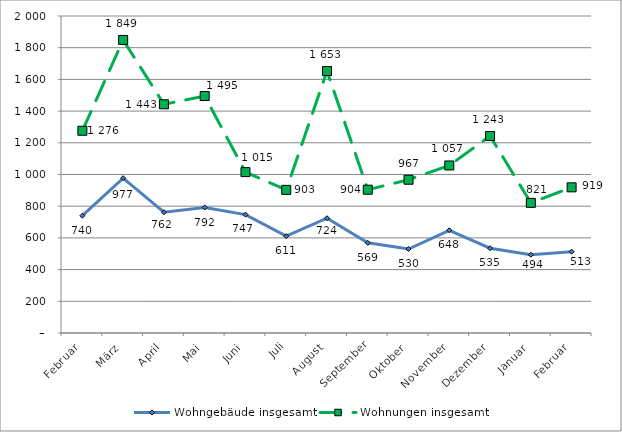
| Category | Wohngebäude insgesamt | Wohnungen insgesamt |
|---|---|---|
| Februar | 740 | 1276 |
| März | 977 | 1849 |
| April | 762 | 1443 |
| Mai | 792 | 1495 |
| Juni | 747 | 1015 |
| Juli | 611 | 903 |
| August | 724 | 1653 |
| September | 569 | 904 |
| Oktober | 530 | 967 |
| November | 648 | 1057 |
| Dezember | 535 | 1243 |
| Januar | 494 | 821 |
| Februar | 513 | 919 |